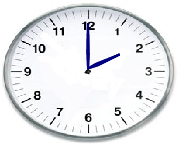
| Category | Series 0 |
|---|---|
| 0.0 | 0 |
| 0.19700268840168048 | 0.154 |
| 0.7794228634059949 | 0.45 |
| 0.23179596364169686 | 0.094 |
| 0.0 | 0 |
| 0.20725939313876043 | 0.14 |
| 0.7794228634059949 | 0.45 |
| 0.22469851157479176 | 0.11 |
| 0.0 | 0 |
| -0.017449748351250367 | 0.5 |
| 8.882326298087495e-17 | 1.45 |
| -0.008726203218641738 | 0.5 |
| 0.0 | 0 |
| 0.01744974835125054 | 0.5 |
| 8.882326298087495e-17 | 1.45 |
| 0.0087262032186418 | 0.5 |
| 0.0 | 0 |